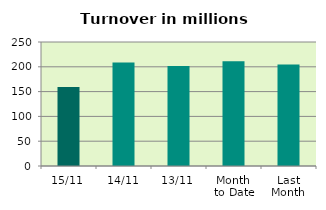
| Category | Series 0 |
|---|---|
| 15/11 | 159.284 |
| 14/11 | 208.711 |
| 13/11 | 201.552 |
| Month 
to Date | 211.162 |
| Last
Month | 204.729 |